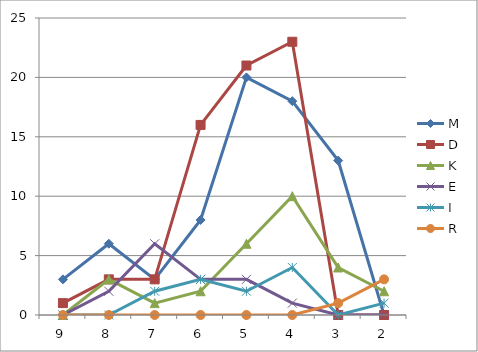
| Category | M | D | K | E | I | R |
|---|---|---|---|---|---|---|
| 9.0 | 3 | 1 | 0 | 0 | 0 | 0 |
| 8.0 | 6 | 3 | 3 | 2 | 0 | 0 |
| 7.0 | 3 | 3 | 1 | 6 | 2 | 0 |
| 6.0 | 8 | 16 | 2 | 3 | 3 | 0 |
| 5.0 | 20 | 21 | 6 | 3 | 2 | 0 |
| 4.0 | 18 | 23 | 10 | 1 | 4 | 0 |
| 3.0 | 13 | 0 | 4 | 0 | 0 | 1 |
| 2.0 | 0 | 0 | 2 | 0 | 1 | 3 |